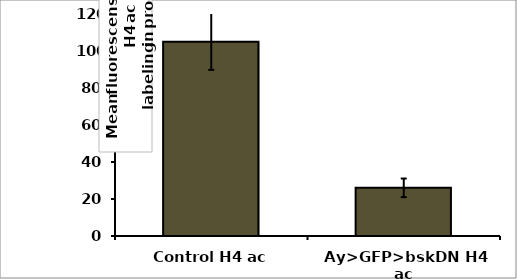
| Category | Series 0 |
|---|---|
| Control H4 ac | 105.03 |
| Ay>GFP>bskDN H4 ac | 26.034 |